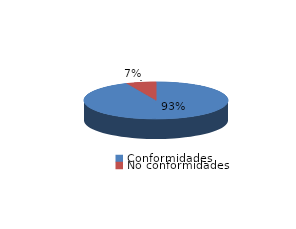
| Category | Series 0 |
|---|---|
| Conformidades | 280 |
| No conformidades | 20 |